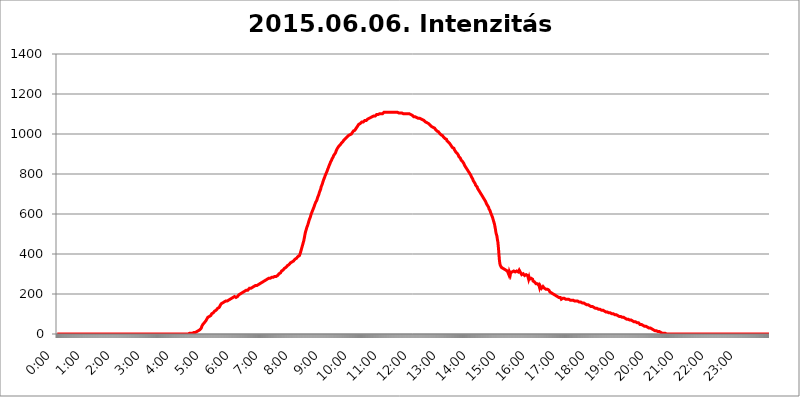
| Category | 2015.06.06. Intenzitás [W/m^2] |
|---|---|
| 0.0 | 0 |
| 0.0006944444444444445 | 0 |
| 0.001388888888888889 | 0 |
| 0.0020833333333333333 | 0 |
| 0.002777777777777778 | 0 |
| 0.003472222222222222 | 0 |
| 0.004166666666666667 | 0 |
| 0.004861111111111111 | 0 |
| 0.005555555555555556 | 0 |
| 0.0062499999999999995 | 0 |
| 0.006944444444444444 | 0 |
| 0.007638888888888889 | 0 |
| 0.008333333333333333 | 0 |
| 0.009027777777777779 | 0 |
| 0.009722222222222222 | 0 |
| 0.010416666666666666 | 0 |
| 0.011111111111111112 | 0 |
| 0.011805555555555555 | 0 |
| 0.012499999999999999 | 0 |
| 0.013194444444444444 | 0 |
| 0.013888888888888888 | 0 |
| 0.014583333333333332 | 0 |
| 0.015277777777777777 | 0 |
| 0.015972222222222224 | 0 |
| 0.016666666666666666 | 0 |
| 0.017361111111111112 | 0 |
| 0.018055555555555557 | 0 |
| 0.01875 | 0 |
| 0.019444444444444445 | 0 |
| 0.02013888888888889 | 0 |
| 0.020833333333333332 | 0 |
| 0.02152777777777778 | 0 |
| 0.022222222222222223 | 0 |
| 0.02291666666666667 | 0 |
| 0.02361111111111111 | 0 |
| 0.024305555555555556 | 0 |
| 0.024999999999999998 | 0 |
| 0.025694444444444447 | 0 |
| 0.02638888888888889 | 0 |
| 0.027083333333333334 | 0 |
| 0.027777777777777776 | 0 |
| 0.02847222222222222 | 0 |
| 0.029166666666666664 | 0 |
| 0.029861111111111113 | 0 |
| 0.030555555555555555 | 0 |
| 0.03125 | 0 |
| 0.03194444444444445 | 0 |
| 0.03263888888888889 | 0 |
| 0.03333333333333333 | 0 |
| 0.034027777777777775 | 0 |
| 0.034722222222222224 | 0 |
| 0.035416666666666666 | 0 |
| 0.036111111111111115 | 0 |
| 0.03680555555555556 | 0 |
| 0.0375 | 0 |
| 0.03819444444444444 | 0 |
| 0.03888888888888889 | 0 |
| 0.03958333333333333 | 0 |
| 0.04027777777777778 | 0 |
| 0.04097222222222222 | 0 |
| 0.041666666666666664 | 0 |
| 0.042361111111111106 | 0 |
| 0.04305555555555556 | 0 |
| 0.043750000000000004 | 0 |
| 0.044444444444444446 | 0 |
| 0.04513888888888889 | 0 |
| 0.04583333333333334 | 0 |
| 0.04652777777777778 | 0 |
| 0.04722222222222222 | 0 |
| 0.04791666666666666 | 0 |
| 0.04861111111111111 | 0 |
| 0.049305555555555554 | 0 |
| 0.049999999999999996 | 0 |
| 0.05069444444444445 | 0 |
| 0.051388888888888894 | 0 |
| 0.052083333333333336 | 0 |
| 0.05277777777777778 | 0 |
| 0.05347222222222222 | 0 |
| 0.05416666666666667 | 0 |
| 0.05486111111111111 | 0 |
| 0.05555555555555555 | 0 |
| 0.05625 | 0 |
| 0.05694444444444444 | 0 |
| 0.057638888888888885 | 0 |
| 0.05833333333333333 | 0 |
| 0.05902777777777778 | 0 |
| 0.059722222222222225 | 0 |
| 0.06041666666666667 | 0 |
| 0.061111111111111116 | 0 |
| 0.06180555555555556 | 0 |
| 0.0625 | 0 |
| 0.06319444444444444 | 0 |
| 0.06388888888888888 | 0 |
| 0.06458333333333334 | 0 |
| 0.06527777777777778 | 0 |
| 0.06597222222222222 | 0 |
| 0.06666666666666667 | 0 |
| 0.06736111111111111 | 0 |
| 0.06805555555555555 | 0 |
| 0.06874999999999999 | 0 |
| 0.06944444444444443 | 0 |
| 0.07013888888888889 | 0 |
| 0.07083333333333333 | 0 |
| 0.07152777777777779 | 0 |
| 0.07222222222222223 | 0 |
| 0.07291666666666667 | 0 |
| 0.07361111111111111 | 0 |
| 0.07430555555555556 | 0 |
| 0.075 | 0 |
| 0.07569444444444444 | 0 |
| 0.0763888888888889 | 0 |
| 0.07708333333333334 | 0 |
| 0.07777777777777778 | 0 |
| 0.07847222222222222 | 0 |
| 0.07916666666666666 | 0 |
| 0.0798611111111111 | 0 |
| 0.08055555555555556 | 0 |
| 0.08125 | 0 |
| 0.08194444444444444 | 0 |
| 0.08263888888888889 | 0 |
| 0.08333333333333333 | 0 |
| 0.08402777777777777 | 0 |
| 0.08472222222222221 | 0 |
| 0.08541666666666665 | 0 |
| 0.08611111111111112 | 0 |
| 0.08680555555555557 | 0 |
| 0.08750000000000001 | 0 |
| 0.08819444444444445 | 0 |
| 0.08888888888888889 | 0 |
| 0.08958333333333333 | 0 |
| 0.09027777777777778 | 0 |
| 0.09097222222222222 | 0 |
| 0.09166666666666667 | 0 |
| 0.09236111111111112 | 0 |
| 0.09305555555555556 | 0 |
| 0.09375 | 0 |
| 0.09444444444444444 | 0 |
| 0.09513888888888888 | 0 |
| 0.09583333333333333 | 0 |
| 0.09652777777777777 | 0 |
| 0.09722222222222222 | 0 |
| 0.09791666666666667 | 0 |
| 0.09861111111111111 | 0 |
| 0.09930555555555555 | 0 |
| 0.09999999999999999 | 0 |
| 0.10069444444444443 | 0 |
| 0.1013888888888889 | 0 |
| 0.10208333333333335 | 0 |
| 0.10277777777777779 | 0 |
| 0.10347222222222223 | 0 |
| 0.10416666666666667 | 0 |
| 0.10486111111111111 | 0 |
| 0.10555555555555556 | 0 |
| 0.10625 | 0 |
| 0.10694444444444444 | 0 |
| 0.1076388888888889 | 0 |
| 0.10833333333333334 | 0 |
| 0.10902777777777778 | 0 |
| 0.10972222222222222 | 0 |
| 0.1111111111111111 | 0 |
| 0.11180555555555556 | 0 |
| 0.11180555555555556 | 0 |
| 0.1125 | 0 |
| 0.11319444444444444 | 0 |
| 0.11388888888888889 | 0 |
| 0.11458333333333333 | 0 |
| 0.11527777777777777 | 0 |
| 0.11597222222222221 | 0 |
| 0.11666666666666665 | 0 |
| 0.1173611111111111 | 0 |
| 0.11805555555555557 | 0 |
| 0.11944444444444445 | 0 |
| 0.12013888888888889 | 0 |
| 0.12083333333333333 | 0 |
| 0.12152777777777778 | 0 |
| 0.12222222222222223 | 0 |
| 0.12291666666666667 | 0 |
| 0.12291666666666667 | 0 |
| 0.12361111111111112 | 0 |
| 0.12430555555555556 | 0 |
| 0.125 | 0 |
| 0.12569444444444444 | 0 |
| 0.12638888888888888 | 0 |
| 0.12708333333333333 | 0 |
| 0.16875 | 0 |
| 0.12847222222222224 | 0 |
| 0.12916666666666668 | 0 |
| 0.12986111111111112 | 0 |
| 0.13055555555555556 | 0 |
| 0.13125 | 0 |
| 0.13194444444444445 | 0 |
| 0.1326388888888889 | 0 |
| 0.13333333333333333 | 0 |
| 0.13402777777777777 | 0 |
| 0.13402777777777777 | 0 |
| 0.13472222222222222 | 0 |
| 0.13541666666666666 | 0 |
| 0.1361111111111111 | 0 |
| 0.13749999999999998 | 0 |
| 0.13819444444444443 | 0 |
| 0.1388888888888889 | 0 |
| 0.13958333333333334 | 0 |
| 0.14027777777777778 | 0 |
| 0.14097222222222222 | 0 |
| 0.14166666666666666 | 0 |
| 0.1423611111111111 | 0 |
| 0.14305555555555557 | 0 |
| 0.14375000000000002 | 0 |
| 0.14444444444444446 | 0 |
| 0.1451388888888889 | 0 |
| 0.1451388888888889 | 0 |
| 0.14652777777777778 | 0 |
| 0.14722222222222223 | 0 |
| 0.14791666666666667 | 0 |
| 0.1486111111111111 | 0 |
| 0.14930555555555555 | 0 |
| 0.15 | 0 |
| 0.15069444444444444 | 0 |
| 0.15138888888888888 | 0 |
| 0.15208333333333332 | 0 |
| 0.15277777777777776 | 0 |
| 0.15347222222222223 | 0 |
| 0.15416666666666667 | 0 |
| 0.15486111111111112 | 0 |
| 0.15555555555555556 | 0 |
| 0.15625 | 0 |
| 0.15694444444444444 | 0 |
| 0.15763888888888888 | 0 |
| 0.15833333333333333 | 0 |
| 0.15902777777777777 | 0 |
| 0.15972222222222224 | 0 |
| 0.16041666666666668 | 0 |
| 0.16111111111111112 | 0 |
| 0.16180555555555556 | 0 |
| 0.1625 | 0 |
| 0.16319444444444445 | 0 |
| 0.1638888888888889 | 0 |
| 0.16458333333333333 | 0 |
| 0.16527777777777777 | 0 |
| 0.16597222222222222 | 0 |
| 0.16666666666666666 | 0 |
| 0.1673611111111111 | 0 |
| 0.16805555555555554 | 0 |
| 0.16874999999999998 | 0 |
| 0.16944444444444443 | 0 |
| 0.17013888888888887 | 0 |
| 0.1708333333333333 | 0 |
| 0.17152777777777775 | 0 |
| 0.17222222222222225 | 0 |
| 0.1729166666666667 | 0 |
| 0.17361111111111113 | 0 |
| 0.17430555555555557 | 0 |
| 0.17500000000000002 | 0 |
| 0.17569444444444446 | 0 |
| 0.1763888888888889 | 0 |
| 0.17708333333333334 | 0 |
| 0.17777777777777778 | 0 |
| 0.17847222222222223 | 0 |
| 0.17916666666666667 | 0 |
| 0.1798611111111111 | 0 |
| 0.18055555555555555 | 0 |
| 0.18125 | 0 |
| 0.18194444444444444 | 0 |
| 0.1826388888888889 | 0 |
| 0.18333333333333335 | 0 |
| 0.1840277777777778 | 0 |
| 0.18472222222222223 | 3.525 |
| 0.18541666666666667 | 3.525 |
| 0.18611111111111112 | 3.525 |
| 0.18680555555555556 | 3.525 |
| 0.1875 | 3.525 |
| 0.18819444444444444 | 3.525 |
| 0.18888888888888888 | 3.525 |
| 0.18958333333333333 | 3.525 |
| 0.19027777777777777 | 3.525 |
| 0.1909722222222222 | 7.887 |
| 0.19166666666666665 | 7.887 |
| 0.19236111111111112 | 7.887 |
| 0.19305555555555554 | 7.887 |
| 0.19375 | 7.887 |
| 0.19444444444444445 | 12.257 |
| 0.1951388888888889 | 12.257 |
| 0.19583333333333333 | 12.257 |
| 0.19652777777777777 | 12.257 |
| 0.19722222222222222 | 16.636 |
| 0.19791666666666666 | 16.636 |
| 0.1986111111111111 | 16.636 |
| 0.19930555555555554 | 21.024 |
| 0.19999999999999998 | 21.024 |
| 0.20069444444444443 | 21.024 |
| 0.20138888888888887 | 25.419 |
| 0.2020833333333333 | 29.823 |
| 0.2027777777777778 | 38.653 |
| 0.2034722222222222 | 43.079 |
| 0.2041666666666667 | 47.511 |
| 0.20486111111111113 | 47.511 |
| 0.20555555555555557 | 51.951 |
| 0.20625000000000002 | 56.398 |
| 0.20694444444444446 | 56.398 |
| 0.2076388888888889 | 60.85 |
| 0.20833333333333334 | 65.31 |
| 0.20902777777777778 | 69.775 |
| 0.20972222222222223 | 74.246 |
| 0.21041666666666667 | 78.722 |
| 0.2111111111111111 | 83.205 |
| 0.21180555555555555 | 83.205 |
| 0.2125 | 83.205 |
| 0.21319444444444444 | 87.692 |
| 0.2138888888888889 | 87.692 |
| 0.21458333333333335 | 92.184 |
| 0.2152777777777778 | 92.184 |
| 0.21597222222222223 | 96.682 |
| 0.21666666666666667 | 101.184 |
| 0.21736111111111112 | 101.184 |
| 0.21805555555555556 | 105.69 |
| 0.21875 | 105.69 |
| 0.21944444444444444 | 110.201 |
| 0.22013888888888888 | 110.201 |
| 0.22083333333333333 | 114.716 |
| 0.22152777777777777 | 114.716 |
| 0.2222222222222222 | 119.235 |
| 0.22291666666666665 | 119.235 |
| 0.2236111111111111 | 123.758 |
| 0.22430555555555556 | 123.758 |
| 0.225 | 128.284 |
| 0.22569444444444445 | 128.284 |
| 0.2263888888888889 | 132.814 |
| 0.22708333333333333 | 132.814 |
| 0.22777777777777777 | 137.347 |
| 0.22847222222222222 | 141.884 |
| 0.22916666666666666 | 146.423 |
| 0.2298611111111111 | 150.964 |
| 0.23055555555555554 | 150.964 |
| 0.23124999999999998 | 155.509 |
| 0.23194444444444443 | 155.509 |
| 0.23263888888888887 | 155.509 |
| 0.2333333333333333 | 155.509 |
| 0.2340277777777778 | 160.056 |
| 0.2347222222222222 | 160.056 |
| 0.2354166666666667 | 160.056 |
| 0.23611111111111113 | 164.605 |
| 0.23680555555555557 | 164.605 |
| 0.23750000000000002 | 164.605 |
| 0.23819444444444446 | 164.605 |
| 0.2388888888888889 | 169.156 |
| 0.23958333333333334 | 169.156 |
| 0.24027777777777778 | 169.156 |
| 0.24097222222222223 | 169.156 |
| 0.24166666666666667 | 169.156 |
| 0.2423611111111111 | 173.709 |
| 0.24305555555555555 | 173.709 |
| 0.24375 | 173.709 |
| 0.24444444444444446 | 178.264 |
| 0.24513888888888888 | 178.264 |
| 0.24583333333333335 | 182.82 |
| 0.2465277777777778 | 182.82 |
| 0.24722222222222223 | 182.82 |
| 0.24791666666666667 | 187.378 |
| 0.24861111111111112 | 187.378 |
| 0.24930555555555556 | 187.378 |
| 0.25 | 187.378 |
| 0.25069444444444444 | 182.82 |
| 0.2513888888888889 | 187.378 |
| 0.2520833333333333 | 182.82 |
| 0.25277777777777777 | 187.378 |
| 0.2534722222222222 | 191.937 |
| 0.25416666666666665 | 191.937 |
| 0.2548611111111111 | 196.497 |
| 0.2555555555555556 | 201.058 |
| 0.25625000000000003 | 201.058 |
| 0.2569444444444445 | 201.058 |
| 0.2576388888888889 | 201.058 |
| 0.25833333333333336 | 205.62 |
| 0.2590277777777778 | 205.62 |
| 0.25972222222222224 | 205.62 |
| 0.2604166666666667 | 210.182 |
| 0.2611111111111111 | 210.182 |
| 0.26180555555555557 | 210.182 |
| 0.2625 | 210.182 |
| 0.26319444444444445 | 214.746 |
| 0.2638888888888889 | 214.746 |
| 0.26458333333333334 | 214.746 |
| 0.2652777777777778 | 219.309 |
| 0.2659722222222222 | 219.309 |
| 0.26666666666666666 | 219.309 |
| 0.2673611111111111 | 219.309 |
| 0.26805555555555555 | 223.873 |
| 0.26875 | 223.873 |
| 0.26944444444444443 | 228.436 |
| 0.2701388888888889 | 228.436 |
| 0.2708333333333333 | 228.436 |
| 0.27152777777777776 | 228.436 |
| 0.2722222222222222 | 228.436 |
| 0.27291666666666664 | 233 |
| 0.2736111111111111 | 233 |
| 0.2743055555555555 | 237.564 |
| 0.27499999999999997 | 237.564 |
| 0.27569444444444446 | 237.564 |
| 0.27638888888888885 | 237.564 |
| 0.27708333333333335 | 242.127 |
| 0.2777777777777778 | 242.127 |
| 0.27847222222222223 | 242.127 |
| 0.2791666666666667 | 242.127 |
| 0.2798611111111111 | 242.127 |
| 0.28055555555555556 | 246.689 |
| 0.28125 | 246.689 |
| 0.28194444444444444 | 246.689 |
| 0.2826388888888889 | 251.251 |
| 0.2833333333333333 | 251.251 |
| 0.28402777777777777 | 251.251 |
| 0.2847222222222222 | 251.251 |
| 0.28541666666666665 | 255.813 |
| 0.28611111111111115 | 255.813 |
| 0.28680555555555554 | 255.813 |
| 0.28750000000000003 | 260.373 |
| 0.2881944444444445 | 260.373 |
| 0.2888888888888889 | 260.373 |
| 0.28958333333333336 | 260.373 |
| 0.2902777777777778 | 264.932 |
| 0.29097222222222224 | 264.932 |
| 0.2916666666666667 | 269.49 |
| 0.2923611111111111 | 269.49 |
| 0.29305555555555557 | 269.49 |
| 0.29375 | 269.49 |
| 0.29444444444444445 | 274.047 |
| 0.2951388888888889 | 274.047 |
| 0.29583333333333334 | 274.047 |
| 0.2965277777777778 | 278.603 |
| 0.2972222222222222 | 278.603 |
| 0.29791666666666666 | 278.603 |
| 0.2986111111111111 | 278.603 |
| 0.29930555555555555 | 278.603 |
| 0.3 | 278.603 |
| 0.30069444444444443 | 283.156 |
| 0.3013888888888889 | 283.156 |
| 0.3020833333333333 | 283.156 |
| 0.30277777777777776 | 283.156 |
| 0.3034722222222222 | 287.709 |
| 0.30416666666666664 | 287.709 |
| 0.3048611111111111 | 287.709 |
| 0.3055555555555555 | 287.709 |
| 0.30624999999999997 | 287.709 |
| 0.3069444444444444 | 287.709 |
| 0.3076388888888889 | 287.709 |
| 0.30833333333333335 | 292.259 |
| 0.3090277777777778 | 292.259 |
| 0.30972222222222223 | 296.808 |
| 0.3104166666666667 | 296.808 |
| 0.3111111111111111 | 301.354 |
| 0.31180555555555556 | 305.898 |
| 0.3125 | 305.898 |
| 0.31319444444444444 | 305.898 |
| 0.3138888888888889 | 310.44 |
| 0.3145833333333333 | 314.98 |
| 0.31527777777777777 | 314.98 |
| 0.3159722222222222 | 319.517 |
| 0.31666666666666665 | 319.517 |
| 0.31736111111111115 | 324.052 |
| 0.31805555555555554 | 324.052 |
| 0.31875000000000003 | 328.584 |
| 0.3194444444444445 | 328.584 |
| 0.3201388888888889 | 333.113 |
| 0.32083333333333336 | 333.113 |
| 0.3215277777777778 | 333.113 |
| 0.32222222222222224 | 337.639 |
| 0.3229166666666667 | 342.162 |
| 0.3236111111111111 | 342.162 |
| 0.32430555555555557 | 342.162 |
| 0.325 | 346.682 |
| 0.32569444444444445 | 351.198 |
| 0.3263888888888889 | 351.198 |
| 0.32708333333333334 | 355.712 |
| 0.3277777777777778 | 355.712 |
| 0.3284722222222222 | 355.712 |
| 0.32916666666666666 | 360.221 |
| 0.3298611111111111 | 360.221 |
| 0.33055555555555555 | 364.728 |
| 0.33125 | 364.728 |
| 0.33194444444444443 | 369.23 |
| 0.3326388888888889 | 369.23 |
| 0.3333333333333333 | 373.729 |
| 0.3340277777777778 | 373.729 |
| 0.3347222222222222 | 378.224 |
| 0.3354166666666667 | 378.224 |
| 0.3361111111111111 | 382.715 |
| 0.3368055555555556 | 382.715 |
| 0.33749999999999997 | 387.202 |
| 0.33819444444444446 | 387.202 |
| 0.33888888888888885 | 391.685 |
| 0.33958333333333335 | 391.685 |
| 0.34027777777777773 | 396.164 |
| 0.34097222222222223 | 405.108 |
| 0.3416666666666666 | 409.574 |
| 0.3423611111111111 | 422.943 |
| 0.3430555555555555 | 431.833 |
| 0.34375 | 440.702 |
| 0.3444444444444445 | 449.551 |
| 0.3451388888888889 | 458.38 |
| 0.3458333333333334 | 467.187 |
| 0.34652777777777777 | 480.356 |
| 0.34722222222222227 | 493.475 |
| 0.34791666666666665 | 506.542 |
| 0.34861111111111115 | 515.223 |
| 0.34930555555555554 | 523.88 |
| 0.35000000000000003 | 532.513 |
| 0.3506944444444444 | 536.82 |
| 0.3513888888888889 | 545.416 |
| 0.3520833333333333 | 553.986 |
| 0.3527777777777778 | 558.261 |
| 0.3534722222222222 | 571.049 |
| 0.3541666666666667 | 575.299 |
| 0.3548611111111111 | 583.779 |
| 0.35555555555555557 | 592.233 |
| 0.35625 | 600.661 |
| 0.35694444444444445 | 604.864 |
| 0.3576388888888889 | 613.252 |
| 0.35833333333333334 | 617.436 |
| 0.3590277777777778 | 625.784 |
| 0.3597222222222222 | 629.948 |
| 0.36041666666666666 | 638.256 |
| 0.3611111111111111 | 646.537 |
| 0.36180555555555555 | 650.667 |
| 0.3625 | 658.909 |
| 0.36319444444444443 | 663.019 |
| 0.3638888888888889 | 667.123 |
| 0.3645833333333333 | 675.311 |
| 0.3652777777777778 | 683.473 |
| 0.3659722222222222 | 687.544 |
| 0.3666666666666667 | 695.666 |
| 0.3673611111111111 | 703.762 |
| 0.3680555555555556 | 711.832 |
| 0.36874999999999997 | 715.858 |
| 0.36944444444444446 | 723.889 |
| 0.37013888888888885 | 735.89 |
| 0.37083333333333335 | 739.877 |
| 0.37152777777777773 | 747.834 |
| 0.37222222222222223 | 755.766 |
| 0.3729166666666666 | 759.723 |
| 0.3736111111111111 | 771.559 |
| 0.3743055555555555 | 775.492 |
| 0.375 | 783.342 |
| 0.3756944444444445 | 791.169 |
| 0.3763888888888889 | 795.074 |
| 0.3770833333333334 | 802.868 |
| 0.37777777777777777 | 806.757 |
| 0.37847222222222227 | 814.519 |
| 0.37916666666666665 | 822.26 |
| 0.37986111111111115 | 826.123 |
| 0.38055555555555554 | 833.834 |
| 0.38125000000000003 | 841.526 |
| 0.3819444444444444 | 845.365 |
| 0.3826388888888889 | 853.029 |
| 0.3833333333333333 | 860.676 |
| 0.3840277777777778 | 864.493 |
| 0.3847222222222222 | 868.305 |
| 0.3854166666666667 | 875.918 |
| 0.3861111111111111 | 879.719 |
| 0.38680555555555557 | 883.516 |
| 0.3875 | 891.099 |
| 0.38819444444444445 | 894.885 |
| 0.3888888888888889 | 898.668 |
| 0.38958333333333334 | 902.447 |
| 0.3902777777777778 | 906.223 |
| 0.3909722222222222 | 913.766 |
| 0.39166666666666666 | 917.534 |
| 0.3923611111111111 | 925.06 |
| 0.39305555555555555 | 928.819 |
| 0.39375 | 932.576 |
| 0.39444444444444443 | 936.33 |
| 0.3951388888888889 | 940.082 |
| 0.3958333333333333 | 940.082 |
| 0.3965277777777778 | 943.832 |
| 0.3972222222222222 | 947.58 |
| 0.3979166666666667 | 951.327 |
| 0.3986111111111111 | 955.071 |
| 0.3993055555555556 | 958.814 |
| 0.39999999999999997 | 958.814 |
| 0.40069444444444446 | 962.555 |
| 0.40138888888888885 | 966.295 |
| 0.40208333333333335 | 970.034 |
| 0.40277777777777773 | 970.034 |
| 0.40347222222222223 | 973.772 |
| 0.4041666666666666 | 977.508 |
| 0.4048611111111111 | 977.508 |
| 0.4055555555555555 | 981.244 |
| 0.40625 | 984.98 |
| 0.4069444444444445 | 984.98 |
| 0.4076388888888889 | 988.714 |
| 0.4083333333333334 | 992.448 |
| 0.40902777777777777 | 992.448 |
| 0.40972222222222227 | 992.448 |
| 0.41041666666666665 | 996.182 |
| 0.41111111111111115 | 996.182 |
| 0.41180555555555554 | 999.916 |
| 0.41250000000000003 | 999.916 |
| 0.4131944444444444 | 1003.65 |
| 0.4138888888888889 | 1007.383 |
| 0.4145833333333333 | 1011.118 |
| 0.4152777777777778 | 1014.852 |
| 0.4159722222222222 | 1014.852 |
| 0.4166666666666667 | 1018.587 |
| 0.4173611111111111 | 1018.587 |
| 0.41805555555555557 | 1022.323 |
| 0.41875 | 1026.06 |
| 0.41944444444444445 | 1029.798 |
| 0.4201388888888889 | 1033.537 |
| 0.42083333333333334 | 1037.277 |
| 0.4215277777777778 | 1041.019 |
| 0.4222222222222222 | 1044.762 |
| 0.42291666666666666 | 1048.508 |
| 0.4236111111111111 | 1052.255 |
| 0.42430555555555555 | 1052.255 |
| 0.425 | 1052.255 |
| 0.42569444444444443 | 1056.004 |
| 0.4263888888888889 | 1056.004 |
| 0.4270833333333333 | 1059.756 |
| 0.4277777777777778 | 1059.756 |
| 0.4284722222222222 | 1063.51 |
| 0.4291666666666667 | 1059.756 |
| 0.4298611111111111 | 1063.51 |
| 0.4305555555555556 | 1063.51 |
| 0.43124999999999997 | 1067.267 |
| 0.43194444444444446 | 1067.267 |
| 0.43263888888888885 | 1067.267 |
| 0.43333333333333335 | 1067.267 |
| 0.43402777777777773 | 1071.027 |
| 0.43472222222222223 | 1071.027 |
| 0.4354166666666666 | 1074.789 |
| 0.4361111111111111 | 1078.555 |
| 0.4368055555555555 | 1078.555 |
| 0.4375 | 1078.555 |
| 0.4381944444444445 | 1082.324 |
| 0.4388888888888889 | 1082.324 |
| 0.4395833333333334 | 1082.324 |
| 0.44027777777777777 | 1082.324 |
| 0.44097222222222227 | 1086.097 |
| 0.44166666666666665 | 1086.097 |
| 0.44236111111111115 | 1086.097 |
| 0.44305555555555554 | 1086.097 |
| 0.44375000000000003 | 1089.873 |
| 0.4444444444444444 | 1089.873 |
| 0.4451388888888889 | 1089.873 |
| 0.4458333333333333 | 1089.873 |
| 0.4465277777777778 | 1093.653 |
| 0.4472222222222222 | 1093.653 |
| 0.4479166666666667 | 1097.437 |
| 0.4486111111111111 | 1097.437 |
| 0.44930555555555557 | 1097.437 |
| 0.45 | 1097.437 |
| 0.45069444444444445 | 1101.226 |
| 0.4513888888888889 | 1101.226 |
| 0.45208333333333334 | 1101.226 |
| 0.4527777777777778 | 1101.226 |
| 0.4534722222222222 | 1101.226 |
| 0.45416666666666666 | 1101.226 |
| 0.4548611111111111 | 1101.226 |
| 0.45555555555555555 | 1101.226 |
| 0.45625 | 1101.226 |
| 0.45694444444444443 | 1105.019 |
| 0.4576388888888889 | 1105.019 |
| 0.4583333333333333 | 1108.816 |
| 0.4590277777777778 | 1108.816 |
| 0.4597222222222222 | 1105.019 |
| 0.4604166666666667 | 1108.816 |
| 0.4611111111111111 | 1108.816 |
| 0.4618055555555556 | 1108.816 |
| 0.46249999999999997 | 1108.816 |
| 0.46319444444444446 | 1108.816 |
| 0.46388888888888885 | 1108.816 |
| 0.46458333333333335 | 1108.816 |
| 0.46527777777777773 | 1108.816 |
| 0.46597222222222223 | 1108.816 |
| 0.4666666666666666 | 1108.816 |
| 0.4673611111111111 | 1108.816 |
| 0.4680555555555555 | 1108.816 |
| 0.46875 | 1108.816 |
| 0.4694444444444445 | 1108.816 |
| 0.4701388888888889 | 1108.816 |
| 0.4708333333333334 | 1108.816 |
| 0.47152777777777777 | 1108.816 |
| 0.47222222222222227 | 1108.816 |
| 0.47291666666666665 | 1108.816 |
| 0.47361111111111115 | 1108.816 |
| 0.47430555555555554 | 1108.816 |
| 0.47500000000000003 | 1108.816 |
| 0.4756944444444444 | 1108.816 |
| 0.4763888888888889 | 1108.816 |
| 0.4770833333333333 | 1108.816 |
| 0.4777777777777778 | 1108.816 |
| 0.4784722222222222 | 1108.816 |
| 0.4791666666666667 | 1105.019 |
| 0.4798611111111111 | 1105.019 |
| 0.48055555555555557 | 1105.019 |
| 0.48125 | 1105.019 |
| 0.48194444444444445 | 1105.019 |
| 0.4826388888888889 | 1105.019 |
| 0.48333333333333334 | 1105.019 |
| 0.4840277777777778 | 1105.019 |
| 0.4847222222222222 | 1101.226 |
| 0.48541666666666666 | 1101.226 |
| 0.4861111111111111 | 1101.226 |
| 0.48680555555555555 | 1101.226 |
| 0.4875 | 1101.226 |
| 0.48819444444444443 | 1101.226 |
| 0.4888888888888889 | 1101.226 |
| 0.4895833333333333 | 1101.226 |
| 0.4902777777777778 | 1101.226 |
| 0.4909722222222222 | 1101.226 |
| 0.4916666666666667 | 1101.226 |
| 0.4923611111111111 | 1101.226 |
| 0.4930555555555556 | 1097.437 |
| 0.49374999999999997 | 1101.226 |
| 0.49444444444444446 | 1101.226 |
| 0.49513888888888885 | 1097.437 |
| 0.49583333333333335 | 1097.437 |
| 0.49652777777777773 | 1097.437 |
| 0.49722222222222223 | 1093.653 |
| 0.4979166666666666 | 1093.653 |
| 0.4986111111111111 | 1089.873 |
| 0.4993055555555555 | 1089.873 |
| 0.5 | 1086.097 |
| 0.5006944444444444 | 1086.097 |
| 0.5013888888888889 | 1086.097 |
| 0.5020833333333333 | 1086.097 |
| 0.5027777777777778 | 1082.324 |
| 0.5034722222222222 | 1082.324 |
| 0.5041666666666667 | 1082.324 |
| 0.5048611111111111 | 1082.324 |
| 0.5055555555555555 | 1082.324 |
| 0.50625 | 1078.555 |
| 0.5069444444444444 | 1078.555 |
| 0.5076388888888889 | 1074.789 |
| 0.5083333333333333 | 1078.555 |
| 0.5090277777777777 | 1074.789 |
| 0.5097222222222222 | 1074.789 |
| 0.5104166666666666 | 1074.789 |
| 0.5111111111111112 | 1074.789 |
| 0.5118055555555555 | 1071.027 |
| 0.5125000000000001 | 1071.027 |
| 0.5131944444444444 | 1071.027 |
| 0.513888888888889 | 1067.267 |
| 0.5145833333333333 | 1067.267 |
| 0.5152777777777778 | 1063.51 |
| 0.5159722222222222 | 1063.51 |
| 0.5166666666666667 | 1059.756 |
| 0.517361111111111 | 1059.756 |
| 0.5180555555555556 | 1059.756 |
| 0.5187499999999999 | 1056.004 |
| 0.5194444444444445 | 1056.004 |
| 0.5201388888888888 | 1052.255 |
| 0.5208333333333334 | 1052.255 |
| 0.5215277777777778 | 1048.508 |
| 0.5222222222222223 | 1048.508 |
| 0.5229166666666667 | 1044.762 |
| 0.5236111111111111 | 1044.762 |
| 0.5243055555555556 | 1041.019 |
| 0.525 | 1037.277 |
| 0.5256944444444445 | 1037.277 |
| 0.5263888888888889 | 1033.537 |
| 0.5270833333333333 | 1033.537 |
| 0.5277777777777778 | 1029.798 |
| 0.5284722222222222 | 1029.798 |
| 0.5291666666666667 | 1029.798 |
| 0.5298611111111111 | 1026.06 |
| 0.5305555555555556 | 1022.323 |
| 0.53125 | 1022.323 |
| 0.5319444444444444 | 1018.587 |
| 0.5326388888888889 | 1014.852 |
| 0.5333333333333333 | 1011.118 |
| 0.5340277777777778 | 1011.118 |
| 0.5347222222222222 | 1011.118 |
| 0.5354166666666667 | 1007.383 |
| 0.5361111111111111 | 1003.65 |
| 0.5368055555555555 | 999.916 |
| 0.5375 | 999.916 |
| 0.5381944444444444 | 996.182 |
| 0.5388888888888889 | 992.448 |
| 0.5395833333333333 | 992.448 |
| 0.5402777777777777 | 992.448 |
| 0.5409722222222222 | 992.448 |
| 0.5416666666666666 | 984.98 |
| 0.5423611111111112 | 984.98 |
| 0.5430555555555555 | 981.244 |
| 0.5437500000000001 | 977.508 |
| 0.5444444444444444 | 973.772 |
| 0.545138888888889 | 973.772 |
| 0.5458333333333333 | 973.772 |
| 0.5465277777777778 | 966.295 |
| 0.5472222222222222 | 962.555 |
| 0.5479166666666667 | 962.555 |
| 0.548611111111111 | 958.814 |
| 0.5493055555555556 | 955.071 |
| 0.5499999999999999 | 955.071 |
| 0.5506944444444445 | 951.327 |
| 0.5513888888888888 | 947.58 |
| 0.5520833333333334 | 943.832 |
| 0.5527777777777778 | 940.082 |
| 0.5534722222222223 | 940.082 |
| 0.5541666666666667 | 932.576 |
| 0.5548611111111111 | 932.576 |
| 0.5555555555555556 | 928.819 |
| 0.55625 | 928.819 |
| 0.5569444444444445 | 921.298 |
| 0.5576388888888889 | 917.534 |
| 0.5583333333333333 | 917.534 |
| 0.5590277777777778 | 909.996 |
| 0.5597222222222222 | 909.996 |
| 0.5604166666666667 | 906.223 |
| 0.5611111111111111 | 902.447 |
| 0.5618055555555556 | 898.668 |
| 0.5625 | 894.885 |
| 0.5631944444444444 | 887.309 |
| 0.5638888888888889 | 887.309 |
| 0.5645833333333333 | 883.516 |
| 0.5652777777777778 | 879.719 |
| 0.5659722222222222 | 875.918 |
| 0.5666666666666667 | 868.305 |
| 0.5673611111111111 | 868.305 |
| 0.5680555555555555 | 864.493 |
| 0.56875 | 860.676 |
| 0.5694444444444444 | 856.855 |
| 0.5701388888888889 | 853.029 |
| 0.5708333333333333 | 849.199 |
| 0.5715277777777777 | 841.526 |
| 0.5722222222222222 | 837.682 |
| 0.5729166666666666 | 833.834 |
| 0.5736111111111112 | 829.981 |
| 0.5743055555555555 | 826.123 |
| 0.5750000000000001 | 822.26 |
| 0.5756944444444444 | 818.392 |
| 0.576388888888889 | 814.519 |
| 0.5770833333333333 | 810.641 |
| 0.5777777777777778 | 806.757 |
| 0.5784722222222222 | 802.868 |
| 0.5791666666666667 | 798.974 |
| 0.579861111111111 | 795.074 |
| 0.5805555555555556 | 791.169 |
| 0.5812499999999999 | 783.342 |
| 0.5819444444444445 | 779.42 |
| 0.5826388888888888 | 775.492 |
| 0.5833333333333334 | 767.62 |
| 0.5840277777777778 | 763.674 |
| 0.5847222222222223 | 759.723 |
| 0.5854166666666667 | 755.766 |
| 0.5861111111111111 | 751.803 |
| 0.5868055555555556 | 743.859 |
| 0.5875 | 739.877 |
| 0.5881944444444445 | 739.877 |
| 0.5888888888888889 | 735.89 |
| 0.5895833333333333 | 727.896 |
| 0.5902777777777778 | 723.889 |
| 0.5909722222222222 | 719.877 |
| 0.5916666666666667 | 715.858 |
| 0.5923611111111111 | 711.832 |
| 0.5930555555555556 | 707.8 |
| 0.59375 | 703.762 |
| 0.5944444444444444 | 699.717 |
| 0.5951388888888889 | 695.666 |
| 0.5958333333333333 | 691.608 |
| 0.5965277777777778 | 687.544 |
| 0.5972222222222222 | 683.473 |
| 0.5979166666666667 | 679.395 |
| 0.5986111111111111 | 675.311 |
| 0.5993055555555555 | 671.22 |
| 0.6 | 667.123 |
| 0.6006944444444444 | 663.019 |
| 0.6013888888888889 | 658.909 |
| 0.6020833333333333 | 650.667 |
| 0.6027777777777777 | 646.537 |
| 0.6034722222222222 | 642.4 |
| 0.6041666666666666 | 638.256 |
| 0.6048611111111112 | 634.105 |
| 0.6055555555555555 | 625.784 |
| 0.6062500000000001 | 621.613 |
| 0.6069444444444444 | 617.436 |
| 0.607638888888889 | 609.062 |
| 0.6083333333333333 | 604.864 |
| 0.6090277777777778 | 596.45 |
| 0.6097222222222222 | 592.233 |
| 0.6104166666666667 | 583.779 |
| 0.611111111111111 | 575.299 |
| 0.6118055555555556 | 566.793 |
| 0.6124999999999999 | 558.261 |
| 0.6131944444444445 | 549.704 |
| 0.6138888888888888 | 536.82 |
| 0.6145833333333334 | 523.88 |
| 0.6152777777777778 | 506.542 |
| 0.6159722222222223 | 497.836 |
| 0.6166666666666667 | 489.108 |
| 0.6173611111111111 | 471.582 |
| 0.6180555555555556 | 458.38 |
| 0.61875 | 431.833 |
| 0.6194444444444445 | 400.638 |
| 0.6201388888888889 | 369.23 |
| 0.6208333333333333 | 351.198 |
| 0.6215277777777778 | 342.162 |
| 0.6222222222222222 | 337.639 |
| 0.6229166666666667 | 333.113 |
| 0.6236111111111111 | 333.113 |
| 0.6243055555555556 | 328.584 |
| 0.625 | 328.584 |
| 0.6256944444444444 | 328.584 |
| 0.6263888888888889 | 324.052 |
| 0.6270833333333333 | 324.052 |
| 0.6277777777777778 | 324.052 |
| 0.6284722222222222 | 319.517 |
| 0.6291666666666667 | 319.517 |
| 0.6298611111111111 | 319.517 |
| 0.6305555555555555 | 314.98 |
| 0.63125 | 314.98 |
| 0.6319444444444444 | 310.44 |
| 0.6326388888888889 | 310.44 |
| 0.6333333333333333 | 296.808 |
| 0.6340277777777777 | 310.44 |
| 0.6347222222222222 | 305.898 |
| 0.6354166666666666 | 296.808 |
| 0.6361111111111112 | 310.44 |
| 0.6368055555555555 | 314.98 |
| 0.6375000000000001 | 310.44 |
| 0.6381944444444444 | 310.44 |
| 0.638888888888889 | 310.44 |
| 0.6395833333333333 | 314.98 |
| 0.6402777777777778 | 314.98 |
| 0.6409722222222222 | 319.517 |
| 0.6416666666666667 | 314.98 |
| 0.642361111111111 | 310.44 |
| 0.6430555555555556 | 310.44 |
| 0.6437499999999999 | 314.98 |
| 0.6444444444444445 | 314.98 |
| 0.6451388888888888 | 314.98 |
| 0.6458333333333334 | 314.98 |
| 0.6465277777777778 | 310.44 |
| 0.6472222222222223 | 310.44 |
| 0.6479166666666667 | 319.517 |
| 0.6486111111111111 | 319.517 |
| 0.6493055555555556 | 314.98 |
| 0.65 | 305.898 |
| 0.6506944444444445 | 301.354 |
| 0.6513888888888889 | 296.808 |
| 0.6520833333333333 | 301.354 |
| 0.6527777777777778 | 296.808 |
| 0.6534722222222222 | 301.354 |
| 0.6541666666666667 | 301.354 |
| 0.6548611111111111 | 296.808 |
| 0.6555555555555556 | 292.259 |
| 0.65625 | 292.259 |
| 0.6569444444444444 | 292.259 |
| 0.6576388888888889 | 296.808 |
| 0.6583333333333333 | 292.259 |
| 0.6590277777777778 | 296.808 |
| 0.6597222222222222 | 292.259 |
| 0.6604166666666667 | 287.709 |
| 0.6611111111111111 | 274.047 |
| 0.6618055555555555 | 283.156 |
| 0.6625 | 274.047 |
| 0.6631944444444444 | 278.603 |
| 0.6638888888888889 | 278.603 |
| 0.6645833333333333 | 278.603 |
| 0.6652777777777777 | 278.603 |
| 0.6659722222222222 | 274.047 |
| 0.6666666666666666 | 274.047 |
| 0.6673611111111111 | 264.932 |
| 0.6680555555555556 | 264.932 |
| 0.6687500000000001 | 260.373 |
| 0.6694444444444444 | 260.373 |
| 0.6701388888888888 | 255.813 |
| 0.6708333333333334 | 255.813 |
| 0.6715277777777778 | 251.251 |
| 0.6722222222222222 | 251.251 |
| 0.6729166666666666 | 251.251 |
| 0.6736111111111112 | 251.251 |
| 0.6743055555555556 | 246.689 |
| 0.6749999999999999 | 246.689 |
| 0.6756944444444444 | 242.127 |
| 0.6763888888888889 | 233 |
| 0.6770833333333334 | 242.127 |
| 0.6777777777777777 | 246.689 |
| 0.6784722222222223 | 242.127 |
| 0.6791666666666667 | 228.436 |
| 0.6798611111111111 | 233 |
| 0.6805555555555555 | 233 |
| 0.68125 | 237.564 |
| 0.6819444444444445 | 237.564 |
| 0.6826388888888889 | 233 |
| 0.6833333333333332 | 228.436 |
| 0.6840277777777778 | 223.873 |
| 0.6847222222222222 | 228.436 |
| 0.6854166666666667 | 223.873 |
| 0.686111111111111 | 228.436 |
| 0.6868055555555556 | 223.873 |
| 0.6875 | 223.873 |
| 0.6881944444444444 | 219.309 |
| 0.688888888888889 | 219.309 |
| 0.6895833333333333 | 219.309 |
| 0.6902777777777778 | 214.746 |
| 0.6909722222222222 | 210.182 |
| 0.6916666666666668 | 210.182 |
| 0.6923611111111111 | 210.182 |
| 0.6930555555555555 | 205.62 |
| 0.69375 | 201.058 |
| 0.6944444444444445 | 201.058 |
| 0.6951388888888889 | 201.058 |
| 0.6958333333333333 | 201.058 |
| 0.6965277777777777 | 196.497 |
| 0.6972222222222223 | 196.497 |
| 0.6979166666666666 | 196.497 |
| 0.6986111111111111 | 191.937 |
| 0.6993055555555556 | 191.937 |
| 0.7000000000000001 | 187.378 |
| 0.7006944444444444 | 187.378 |
| 0.7013888888888888 | 187.378 |
| 0.7020833333333334 | 187.378 |
| 0.7027777777777778 | 182.82 |
| 0.7034722222222222 | 182.82 |
| 0.7041666666666666 | 182.82 |
| 0.7048611111111112 | 182.82 |
| 0.7055555555555556 | 182.82 |
| 0.7062499999999999 | 182.82 |
| 0.7069444444444444 | 173.709 |
| 0.7076388888888889 | 178.264 |
| 0.7083333333333334 | 178.264 |
| 0.7090277777777777 | 178.264 |
| 0.7097222222222223 | 178.264 |
| 0.7104166666666667 | 178.264 |
| 0.7111111111111111 | 178.264 |
| 0.7118055555555555 | 173.709 |
| 0.7125 | 173.709 |
| 0.7131944444444445 | 173.709 |
| 0.7138888888888889 | 173.709 |
| 0.7145833333333332 | 173.709 |
| 0.7152777777777778 | 173.709 |
| 0.7159722222222222 | 173.709 |
| 0.7166666666666667 | 173.709 |
| 0.717361111111111 | 173.709 |
| 0.7180555555555556 | 173.709 |
| 0.71875 | 173.709 |
| 0.7194444444444444 | 169.156 |
| 0.720138888888889 | 169.156 |
| 0.7208333333333333 | 169.156 |
| 0.7215277777777778 | 169.156 |
| 0.7222222222222222 | 169.156 |
| 0.7229166666666668 | 169.156 |
| 0.7236111111111111 | 169.156 |
| 0.7243055555555555 | 169.156 |
| 0.725 | 169.156 |
| 0.7256944444444445 | 164.605 |
| 0.7263888888888889 | 164.605 |
| 0.7270833333333333 | 164.605 |
| 0.7277777777777777 | 164.605 |
| 0.7284722222222223 | 164.605 |
| 0.7291666666666666 | 164.605 |
| 0.7298611111111111 | 164.605 |
| 0.7305555555555556 | 164.605 |
| 0.7312500000000001 | 164.605 |
| 0.7319444444444444 | 160.056 |
| 0.7326388888888888 | 160.056 |
| 0.7333333333333334 | 160.056 |
| 0.7340277777777778 | 160.056 |
| 0.7347222222222222 | 160.056 |
| 0.7354166666666666 | 155.509 |
| 0.7361111111111112 | 155.509 |
| 0.7368055555555556 | 155.509 |
| 0.7374999999999999 | 155.509 |
| 0.7381944444444444 | 155.509 |
| 0.7388888888888889 | 155.509 |
| 0.7395833333333334 | 150.964 |
| 0.7402777777777777 | 150.964 |
| 0.7409722222222223 | 150.964 |
| 0.7416666666666667 | 146.423 |
| 0.7423611111111111 | 146.423 |
| 0.7430555555555555 | 146.423 |
| 0.74375 | 146.423 |
| 0.7444444444444445 | 146.423 |
| 0.7451388888888889 | 146.423 |
| 0.7458333333333332 | 141.884 |
| 0.7465277777777778 | 141.884 |
| 0.7472222222222222 | 141.884 |
| 0.7479166666666667 | 137.347 |
| 0.748611111111111 | 137.347 |
| 0.7493055555555556 | 137.347 |
| 0.75 | 137.347 |
| 0.7506944444444444 | 137.347 |
| 0.751388888888889 | 137.347 |
| 0.7520833333333333 | 132.814 |
| 0.7527777777777778 | 132.814 |
| 0.7534722222222222 | 132.814 |
| 0.7541666666666668 | 132.814 |
| 0.7548611111111111 | 128.284 |
| 0.7555555555555555 | 128.284 |
| 0.75625 | 128.284 |
| 0.7569444444444445 | 128.284 |
| 0.7576388888888889 | 128.284 |
| 0.7583333333333333 | 128.284 |
| 0.7590277777777777 | 123.758 |
| 0.7597222222222223 | 123.758 |
| 0.7604166666666666 | 123.758 |
| 0.7611111111111111 | 123.758 |
| 0.7618055555555556 | 123.758 |
| 0.7625000000000001 | 119.235 |
| 0.7631944444444444 | 119.235 |
| 0.7638888888888888 | 119.235 |
| 0.7645833333333334 | 119.235 |
| 0.7652777777777778 | 119.235 |
| 0.7659722222222222 | 114.716 |
| 0.7666666666666666 | 114.716 |
| 0.7673611111111112 | 114.716 |
| 0.7680555555555556 | 114.716 |
| 0.7687499999999999 | 114.716 |
| 0.7694444444444444 | 110.201 |
| 0.7701388888888889 | 110.201 |
| 0.7708333333333334 | 110.201 |
| 0.7715277777777777 | 110.201 |
| 0.7722222222222223 | 110.201 |
| 0.7729166666666667 | 110.201 |
| 0.7736111111111111 | 105.69 |
| 0.7743055555555555 | 105.69 |
| 0.775 | 105.69 |
| 0.7756944444444445 | 105.69 |
| 0.7763888888888889 | 105.69 |
| 0.7770833333333332 | 101.184 |
| 0.7777777777777778 | 101.184 |
| 0.7784722222222222 | 101.184 |
| 0.7791666666666667 | 101.184 |
| 0.779861111111111 | 101.184 |
| 0.7805555555555556 | 101.184 |
| 0.78125 | 96.682 |
| 0.7819444444444444 | 96.682 |
| 0.782638888888889 | 96.682 |
| 0.7833333333333333 | 96.682 |
| 0.7840277777777778 | 96.682 |
| 0.7847222222222222 | 92.184 |
| 0.7854166666666668 | 92.184 |
| 0.7861111111111111 | 92.184 |
| 0.7868055555555555 | 92.184 |
| 0.7875 | 92.184 |
| 0.7881944444444445 | 87.692 |
| 0.7888888888888889 | 87.692 |
| 0.7895833333333333 | 87.692 |
| 0.7902777777777777 | 87.692 |
| 0.7909722222222223 | 87.692 |
| 0.7916666666666666 | 83.205 |
| 0.7923611111111111 | 83.205 |
| 0.7930555555555556 | 83.205 |
| 0.7937500000000001 | 83.205 |
| 0.7944444444444444 | 83.205 |
| 0.7951388888888888 | 83.205 |
| 0.7958333333333334 | 78.722 |
| 0.7965277777777778 | 78.722 |
| 0.7972222222222222 | 78.722 |
| 0.7979166666666666 | 78.722 |
| 0.7986111111111112 | 74.246 |
| 0.7993055555555556 | 74.246 |
| 0.7999999999999999 | 74.246 |
| 0.8006944444444444 | 74.246 |
| 0.8013888888888889 | 74.246 |
| 0.8020833333333334 | 69.775 |
| 0.8027777777777777 | 69.775 |
| 0.8034722222222223 | 69.775 |
| 0.8041666666666667 | 69.775 |
| 0.8048611111111111 | 69.775 |
| 0.8055555555555555 | 65.31 |
| 0.80625 | 65.31 |
| 0.8069444444444445 | 65.31 |
| 0.8076388888888889 | 65.31 |
| 0.8083333333333332 | 65.31 |
| 0.8090277777777778 | 60.85 |
| 0.8097222222222222 | 60.85 |
| 0.8104166666666667 | 60.85 |
| 0.811111111111111 | 60.85 |
| 0.8118055555555556 | 60.85 |
| 0.8125 | 56.398 |
| 0.8131944444444444 | 56.398 |
| 0.813888888888889 | 56.398 |
| 0.8145833333333333 | 56.398 |
| 0.8152777777777778 | 56.398 |
| 0.8159722222222222 | 51.951 |
| 0.8166666666666668 | 51.951 |
| 0.8173611111111111 | 47.511 |
| 0.8180555555555555 | 47.511 |
| 0.81875 | 47.511 |
| 0.8194444444444445 | 47.511 |
| 0.8201388888888889 | 47.511 |
| 0.8208333333333333 | 47.511 |
| 0.8215277777777777 | 43.079 |
| 0.8222222222222223 | 43.079 |
| 0.8229166666666666 | 43.079 |
| 0.8236111111111111 | 38.653 |
| 0.8243055555555556 | 38.653 |
| 0.8250000000000001 | 38.653 |
| 0.8256944444444444 | 38.653 |
| 0.8263888888888888 | 38.653 |
| 0.8270833333333334 | 34.234 |
| 0.8277777777777778 | 34.234 |
| 0.8284722222222222 | 34.234 |
| 0.8291666666666666 | 34.234 |
| 0.8298611111111112 | 29.823 |
| 0.8305555555555556 | 29.823 |
| 0.8312499999999999 | 29.823 |
| 0.8319444444444444 | 29.823 |
| 0.8326388888888889 | 25.419 |
| 0.8333333333333334 | 25.419 |
| 0.8340277777777777 | 25.419 |
| 0.8347222222222223 | 21.024 |
| 0.8354166666666667 | 21.024 |
| 0.8361111111111111 | 21.024 |
| 0.8368055555555555 | 21.024 |
| 0.8375 | 21.024 |
| 0.8381944444444445 | 16.636 |
| 0.8388888888888889 | 16.636 |
| 0.8395833333333332 | 16.636 |
| 0.8402777777777778 | 16.636 |
| 0.8409722222222222 | 16.636 |
| 0.8416666666666667 | 12.257 |
| 0.842361111111111 | 12.257 |
| 0.8430555555555556 | 12.257 |
| 0.84375 | 12.257 |
| 0.8444444444444444 | 12.257 |
| 0.845138888888889 | 7.887 |
| 0.8458333333333333 | 7.887 |
| 0.8465277777777778 | 7.887 |
| 0.8472222222222222 | 7.887 |
| 0.8479166666666668 | 7.887 |
| 0.8486111111111111 | 3.525 |
| 0.8493055555555555 | 3.525 |
| 0.85 | 3.525 |
| 0.8506944444444445 | 3.525 |
| 0.8513888888888889 | 3.525 |
| 0.8520833333333333 | 3.525 |
| 0.8527777777777777 | 3.525 |
| 0.8534722222222223 | 0 |
| 0.8541666666666666 | 0 |
| 0.8548611111111111 | 0 |
| 0.8555555555555556 | 0 |
| 0.8562500000000001 | 0 |
| 0.8569444444444444 | 0 |
| 0.8576388888888888 | 0 |
| 0.8583333333333334 | 0 |
| 0.8590277777777778 | 0 |
| 0.8597222222222222 | 0 |
| 0.8604166666666666 | 0 |
| 0.8611111111111112 | 0 |
| 0.8618055555555556 | 0 |
| 0.8624999999999999 | 0 |
| 0.8631944444444444 | 0 |
| 0.8638888888888889 | 0 |
| 0.8645833333333334 | 0 |
| 0.8652777777777777 | 0 |
| 0.8659722222222223 | 0 |
| 0.8666666666666667 | 0 |
| 0.8673611111111111 | 0 |
| 0.8680555555555555 | 0 |
| 0.86875 | 0 |
| 0.8694444444444445 | 0 |
| 0.8701388888888889 | 0 |
| 0.8708333333333332 | 0 |
| 0.8715277777777778 | 0 |
| 0.8722222222222222 | 0 |
| 0.8729166666666667 | 0 |
| 0.873611111111111 | 0 |
| 0.8743055555555556 | 0 |
| 0.875 | 0 |
| 0.8756944444444444 | 0 |
| 0.876388888888889 | 0 |
| 0.8770833333333333 | 0 |
| 0.8777777777777778 | 0 |
| 0.8784722222222222 | 0 |
| 0.8791666666666668 | 0 |
| 0.8798611111111111 | 0 |
| 0.8805555555555555 | 0 |
| 0.88125 | 0 |
| 0.8819444444444445 | 0 |
| 0.8826388888888889 | 0 |
| 0.8833333333333333 | 0 |
| 0.8840277777777777 | 0 |
| 0.8847222222222223 | 0 |
| 0.8854166666666666 | 0 |
| 0.8861111111111111 | 0 |
| 0.8868055555555556 | 0 |
| 0.8875000000000001 | 0 |
| 0.8881944444444444 | 0 |
| 0.8888888888888888 | 0 |
| 0.8895833333333334 | 0 |
| 0.8902777777777778 | 0 |
| 0.8909722222222222 | 0 |
| 0.8916666666666666 | 0 |
| 0.8923611111111112 | 0 |
| 0.8930555555555556 | 0 |
| 0.8937499999999999 | 0 |
| 0.8944444444444444 | 0 |
| 0.8951388888888889 | 0 |
| 0.8958333333333334 | 0 |
| 0.8965277777777777 | 0 |
| 0.8972222222222223 | 0 |
| 0.8979166666666667 | 0 |
| 0.8986111111111111 | 0 |
| 0.8993055555555555 | 0 |
| 0.9 | 0 |
| 0.9006944444444445 | 0 |
| 0.9013888888888889 | 0 |
| 0.9020833333333332 | 0 |
| 0.9027777777777778 | 0 |
| 0.9034722222222222 | 0 |
| 0.9041666666666667 | 0 |
| 0.904861111111111 | 0 |
| 0.9055555555555556 | 0 |
| 0.90625 | 0 |
| 0.9069444444444444 | 0 |
| 0.907638888888889 | 0 |
| 0.9083333333333333 | 0 |
| 0.9090277777777778 | 0 |
| 0.9097222222222222 | 0 |
| 0.9104166666666668 | 0 |
| 0.9111111111111111 | 0 |
| 0.9118055555555555 | 0 |
| 0.9125 | 0 |
| 0.9131944444444445 | 0 |
| 0.9138888888888889 | 0 |
| 0.9145833333333333 | 0 |
| 0.9152777777777777 | 0 |
| 0.9159722222222223 | 0 |
| 0.9166666666666666 | 0 |
| 0.9173611111111111 | 0 |
| 0.9180555555555556 | 0 |
| 0.9187500000000001 | 0 |
| 0.9194444444444444 | 0 |
| 0.9201388888888888 | 0 |
| 0.9208333333333334 | 0 |
| 0.9215277777777778 | 0 |
| 0.9222222222222222 | 0 |
| 0.9229166666666666 | 0 |
| 0.9236111111111112 | 0 |
| 0.9243055555555556 | 0 |
| 0.9249999999999999 | 0 |
| 0.9256944444444444 | 0 |
| 0.9263888888888889 | 0 |
| 0.9270833333333334 | 0 |
| 0.9277777777777777 | 0 |
| 0.9284722222222223 | 0 |
| 0.9291666666666667 | 0 |
| 0.9298611111111111 | 0 |
| 0.9305555555555555 | 0 |
| 0.93125 | 0 |
| 0.9319444444444445 | 0 |
| 0.9326388888888889 | 0 |
| 0.9333333333333332 | 0 |
| 0.9340277777777778 | 0 |
| 0.9347222222222222 | 0 |
| 0.9354166666666667 | 0 |
| 0.936111111111111 | 0 |
| 0.9368055555555556 | 0 |
| 0.9375 | 0 |
| 0.9381944444444444 | 0 |
| 0.938888888888889 | 0 |
| 0.9395833333333333 | 0 |
| 0.9402777777777778 | 0 |
| 0.9409722222222222 | 0 |
| 0.9416666666666668 | 0 |
| 0.9423611111111111 | 0 |
| 0.9430555555555555 | 0 |
| 0.94375 | 0 |
| 0.9444444444444445 | 0 |
| 0.9451388888888889 | 0 |
| 0.9458333333333333 | 0 |
| 0.9465277777777777 | 0 |
| 0.9472222222222223 | 0 |
| 0.9479166666666666 | 0 |
| 0.9486111111111111 | 0 |
| 0.9493055555555556 | 0 |
| 0.9500000000000001 | 0 |
| 0.9506944444444444 | 0 |
| 0.9513888888888888 | 0 |
| 0.9520833333333334 | 0 |
| 0.9527777777777778 | 0 |
| 0.9534722222222222 | 0 |
| 0.9541666666666666 | 0 |
| 0.9548611111111112 | 0 |
| 0.9555555555555556 | 0 |
| 0.9562499999999999 | 0 |
| 0.9569444444444444 | 0 |
| 0.9576388888888889 | 0 |
| 0.9583333333333334 | 0 |
| 0.9590277777777777 | 0 |
| 0.9597222222222223 | 0 |
| 0.9604166666666667 | 0 |
| 0.9611111111111111 | 0 |
| 0.9618055555555555 | 0 |
| 0.9625 | 0 |
| 0.9631944444444445 | 0 |
| 0.9638888888888889 | 0 |
| 0.9645833333333332 | 0 |
| 0.9652777777777778 | 0 |
| 0.9659722222222222 | 0 |
| 0.9666666666666667 | 0 |
| 0.967361111111111 | 0 |
| 0.9680555555555556 | 0 |
| 0.96875 | 0 |
| 0.9694444444444444 | 0 |
| 0.970138888888889 | 0 |
| 0.9708333333333333 | 0 |
| 0.9715277777777778 | 0 |
| 0.9722222222222222 | 0 |
| 0.9729166666666668 | 0 |
| 0.9736111111111111 | 0 |
| 0.9743055555555555 | 0 |
| 0.975 | 0 |
| 0.9756944444444445 | 0 |
| 0.9763888888888889 | 0 |
| 0.9770833333333333 | 0 |
| 0.9777777777777777 | 0 |
| 0.9784722222222223 | 0 |
| 0.9791666666666666 | 0 |
| 0.9798611111111111 | 0 |
| 0.9805555555555556 | 0 |
| 0.9812500000000001 | 0 |
| 0.9819444444444444 | 0 |
| 0.9826388888888888 | 0 |
| 0.9833333333333334 | 0 |
| 0.9840277777777778 | 0 |
| 0.9847222222222222 | 0 |
| 0.9854166666666666 | 0 |
| 0.9861111111111112 | 0 |
| 0.9868055555555556 | 0 |
| 0.9874999999999999 | 0 |
| 0.9881944444444444 | 0 |
| 0.9888888888888889 | 0 |
| 0.9895833333333334 | 0 |
| 0.9902777777777777 | 0 |
| 0.9909722222222223 | 0 |
| 0.9916666666666667 | 0 |
| 0.9923611111111111 | 0 |
| 0.9930555555555555 | 0 |
| 0.99375 | 0 |
| 0.9944444444444445 | 0 |
| 0.9951388888888889 | 0 |
| 0.9958333333333332 | 0 |
| 0.9965277777777778 | 0 |
| 0.9972222222222222 | 0 |
| 0.9979166666666667 | 0 |
| 0.998611111111111 | 0 |
| 0.9993055555555556 | 0 |